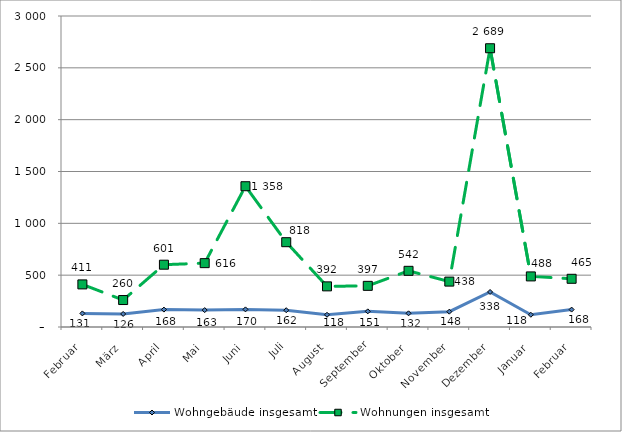
| Category | Wohngebäude insgesamt | Wohnungen insgesamt |
|---|---|---|
| Februar | 131 | 411 |
| März | 126 | 260 |
| April | 168 | 601 |
| Mai | 163 | 616 |
| Juni | 170 | 1358 |
| Juli | 162 | 818 |
| August | 118 | 392 |
| September | 151 | 397 |
| Oktober | 132 | 542 |
| November | 148 | 438 |
| Dezember | 338 | 2689 |
| Januar | 118 | 488 |
| Februar | 168 | 465 |